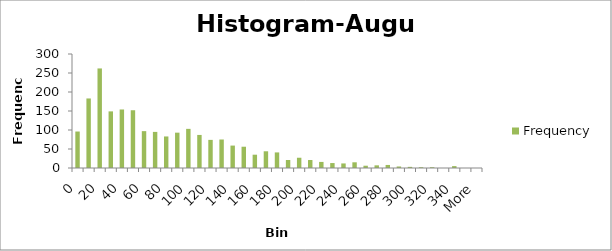
| Category | Frequency |
|---|---|
| 0 | 96 |
| 10 | 183 |
| 20 | 262 |
| 30 | 149 |
| 40 | 154 |
| 50 | 152 |
| 60 | 97 |
| 70 | 95 |
| 80 | 83 |
| 90 | 93 |
| 100 | 103 |
| 110 | 87 |
| 120 | 74 |
| 130 | 75 |
| 140 | 59 |
| 150 | 56 |
| 160 | 35 |
| 170 | 44 |
| 180 | 41 |
| 190 | 21 |
| 200 | 27 |
| 210 | 21 |
| 220 | 16 |
| 230 | 13 |
| 240 | 12 |
| 250 | 15 |
| 260 | 6 |
| 270 | 7 |
| 280 | 8 |
| 290 | 4 |
| 300 | 3 |
| 310 | 2 |
| 320 | 2 |
| 330 | 0 |
| 340 | 5 |
| 350 | 0 |
| More | 0 |